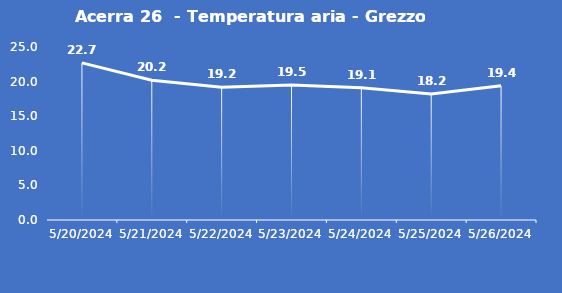
| Category | Acerra 26  - Temperatura aria - Grezzo (°C) |
|---|---|
| 5/20/24 | 22.7 |
| 5/21/24 | 20.2 |
| 5/22/24 | 19.2 |
| 5/23/24 | 19.5 |
| 5/24/24 | 19.1 |
| 5/25/24 | 18.2 |
| 5/26/24 | 19.4 |